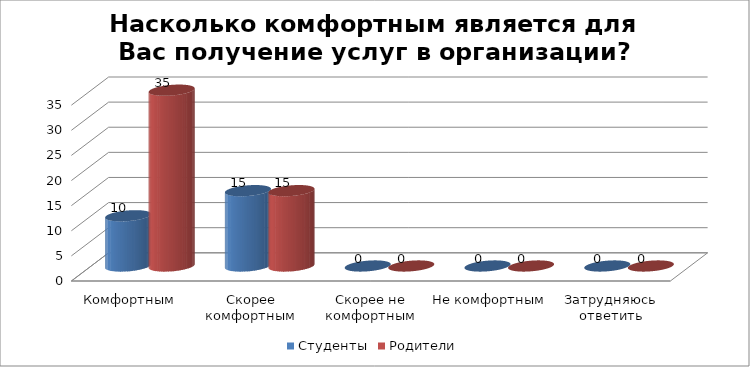
| Category | Студенты | Родители |
|---|---|---|
| Комфортным | 10 | 35 |
| Скорее комфортным | 15 | 15 |
| Скорее не комфортным | 0 | 0 |
| Не комфортным | 0 | 0 |
| Затрудняюсь ответить | 0 | 0 |